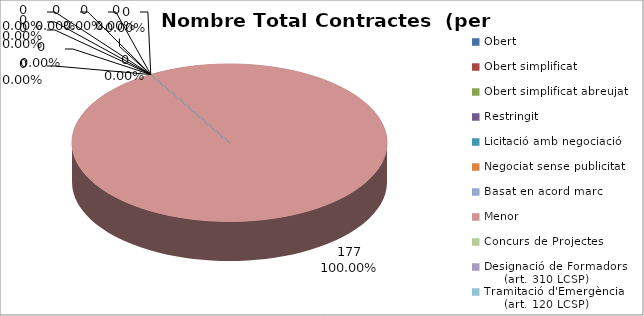
| Category | Nombre Total Contractes |
|---|---|
| Obert | 0 |
| Obert simplificat | 0 |
| Obert simplificat abreujat | 0 |
| Restringit | 0 |
| Licitació amb negociació | 0 |
| Negociat sense publicitat | 0 |
| Basat en acord marc | 0 |
| Menor | 177 |
| Concurs de Projectes | 0 |
| Designació de Formadors
     (art. 310 LCSP) | 0 |
| Tramitació d'Emergència
     (art. 120 LCSP) | 0 |